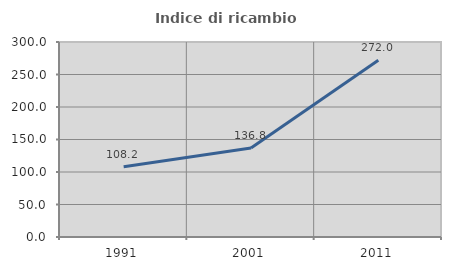
| Category | Indice di ricambio occupazionale  |
|---|---|
| 1991.0 | 108.224 |
| 2001.0 | 136.826 |
| 2011.0 | 271.988 |